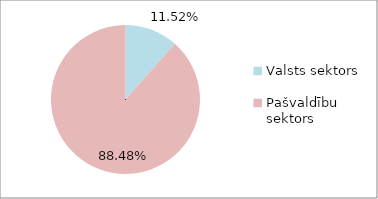
| Category | Series 0 |
|---|---|
| Valsts sektors | 0.115 |
| Pašvaldību sektors | 0.885 |